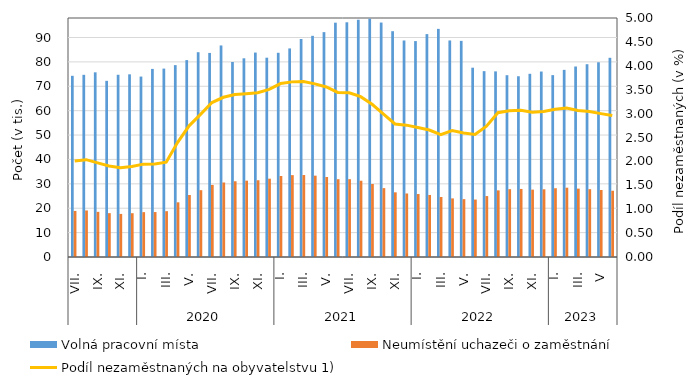
| Category | Volná pracovní místa | Neumístění uchazeči o zaměstnání |
|---|---|---|
| 0 | 74296 | 18895 |
| 1 | 74706 | 19089 |
| 2 | 75727 | 18515 |
| 3 | 72231 | 17985 |
| 4 | 74722 | 17666 |
| 5 | 74905 | 17955 |
| 6 | 73987 | 18390 |
| 7 | 77123 | 18423 |
| 8 | 77251 | 18788 |
| 9 | 78679 | 22421 |
| 10 | 80742 | 25424 |
| 11 | 83969 | 27405 |
| 12 | 83672 | 29567 |
| 13 | 86744 | 30556 |
| 14 | 79961 | 31056 |
| 15 | 81479 | 31302 |
| 16 | 83826 | 31473 |
| 17 | 81719 | 32107 |
| 18 | 83735 | 33217 |
| 19 | 85524 | 33565 |
| 20 | 89385 | 33612 |
| 21 | 90690 | 33352 |
| 22 | 92204 | 32808 |
| 23 | 96081 | 31905 |
| 24 | 96249 | 31917 |
| 25 | 97288 | 31271 |
| 26 | 97734 | 29926 |
| 27 | 96137 | 28242 |
| 28 | 92587 | 26521 |
| 29 | 88785 | 26047 |
| 30 | 88536 | 25817 |
| 31 | 91403 | 25444 |
| 32 | 93541 | 24612 |
| 33 | 88791 | 24028 |
| 34 | 88625 | 23728 |
| 35 | 77627 | 23550 |
| 36 | 76207 | 24989 |
| 37 | 76110 | 27326 |
| 38 | 74541 | 27809 |
| 39 | 74117 | 27914 |
| 40 | 75125 | 27625 |
| 41 | 76045 | 27766 |
| 42 | 74577 | 28199 |
| 43 | 76736 | 28419 |
| 44 | 78112 | 28041 |
| 45 | 79054 | 27810 |
| 46 | 79846 | 27469 |
| 47 | 81683 | 27164 |